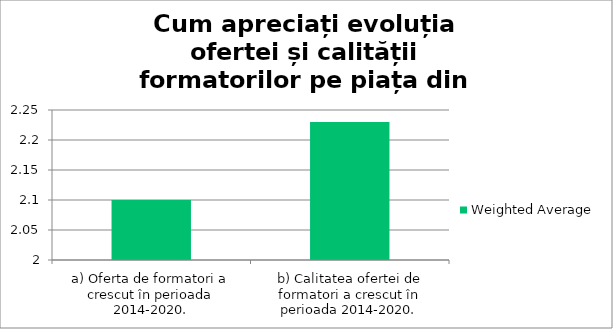
| Category | Weighted Average |
|---|---|
| a) Oferta de formatori a crescut în perioada 2014-2020. | 2.1 |
| b) Calitatea ofertei de formatori a crescut în perioada 2014-2020. | 2.23 |